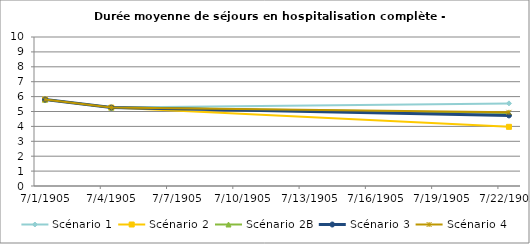
| Category | Scénario 1 | Scénario 2 | Scénario 2B | Scénario 3 | Scénario 4 |
|---|---|---|---|---|---|
| 2009.0 | 5.799 | 5.799 | 5.799 | 5.799 | 5.799 |
| 2012.0 | 5.264 | 5.264 | 5.264 | 5.264 | 5.264 |
| 2030.0 | 5.545 | 3.971 | 4.893 | 4.737 | 4.943 |